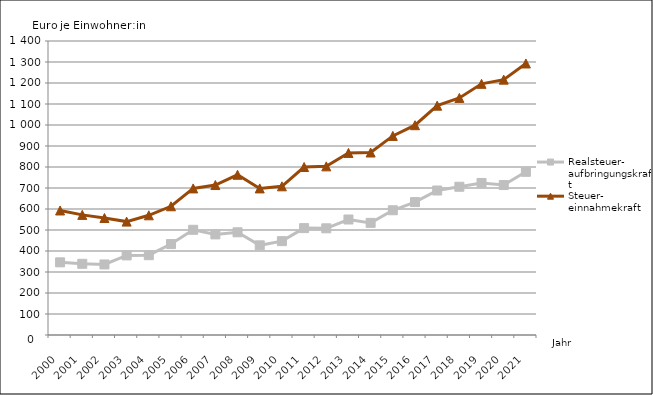
| Category | Realsteuer-
aufbringungskraft | Steuer-
einnahmekraft |
|---|---|---|
| 2000.0 | 346 | 593 |
| 2001.0 | 339 | 572 |
| 2002.0 | 336 | 557 |
| 2003.0 | 379 | 540 |
| 2004.0 | 380 | 570 |
| 2005.0 | 433 | 613 |
| 2006.0 | 501 | 698 |
| 2007.0 | 479 | 714 |
| 2008.0 | 489 | 763 |
| 2009.0 | 427 | 698 |
| 2010.0 | 447 | 708 |
| 2011.0 | 509 | 800 |
| 2012.0 | 508 | 803 |
| 2013.0 | 550 | 867 |
| 2014.0 | 534 | 869 |
| 2015.0 | 594 | 948 |
| 2016.0 | 633 | 999 |
| 2017.0 | 688 | 1092 |
| 2018.0 | 706 | 1129 |
| 2019.0 | 724 | 1196 |
| 2020.0 | 714 | 1216 |
| 2021.0 | 777 | 1293 |